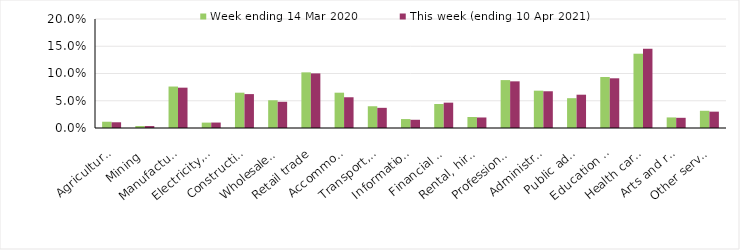
| Category | Week ending 14 Mar 2020 | This week (ending 10 Apr 2021) |
|---|---|---|
| Agriculture, forestry and fishing | 0.012 | 0.01 |
| Mining | 0.004 | 0.004 |
| Manufacturing | 0.076 | 0.074 |
| Electricity, gas, water and waste services | 0.01 | 0.01 |
| Construction | 0.065 | 0.062 |
| Wholesale trade | 0.051 | 0.048 |
| Retail trade | 0.102 | 0.1 |
| Accommodation and food services | 0.065 | 0.056 |
| Transport, postal and warehousing | 0.04 | 0.037 |
| Information media and telecommunications | 0.016 | 0.015 |
| Financial and insurance services | 0.044 | 0.046 |
| Rental, hiring and real estate services | 0.02 | 0.019 |
| Professional, scientific and technical services | 0.088 | 0.086 |
| Administrative and support services | 0.068 | 0.067 |
| Public administration and safety | 0.055 | 0.061 |
| Education and training | 0.094 | 0.091 |
| Health care and social assistance | 0.136 | 0.145 |
| Arts and recreation services | 0.019 | 0.019 |
| Other services | 0.032 | 0.03 |